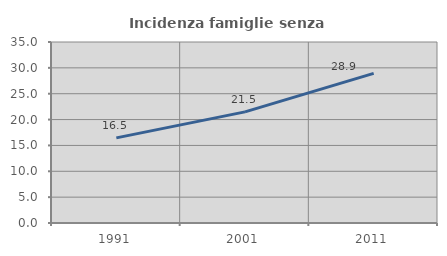
| Category | Incidenza famiglie senza nuclei |
|---|---|
| 1991.0 | 16.458 |
| 2001.0 | 21.494 |
| 2011.0 | 28.921 |